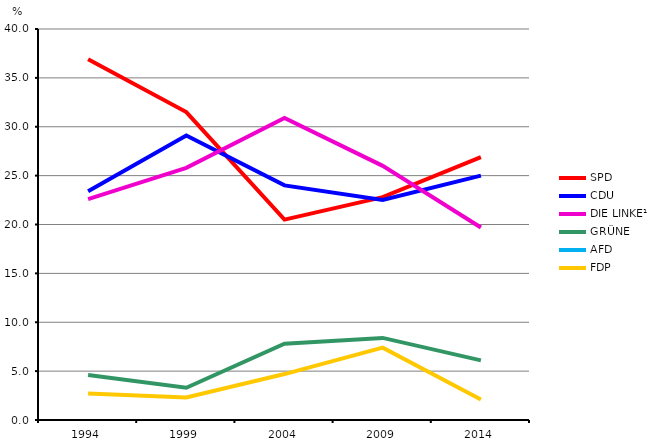
| Category | SPD | CDU | DIE LINKE¹ | GRÜNE | AFD | FDP |
|---|---|---|---|---|---|---|
| 1994.0 | 36.9 | 23.4 | 22.6 | 4.6 | 0 | 2.7 |
| 1999.0 | 31.5 | 29.1 | 25.8 | 3.3 | 0 | 2.3 |
| 2004.0 | 20.5 | 24 | 30.9 | 7.8 | 0 | 4.7 |
| 2009.0 | 22.8 | 22.5 | 26 | 8.4 | 0 | 7.4 |
| 2014.0 | 26.9 | 25 | 19.7 | 6.1 | 8.5 | 2.1 |